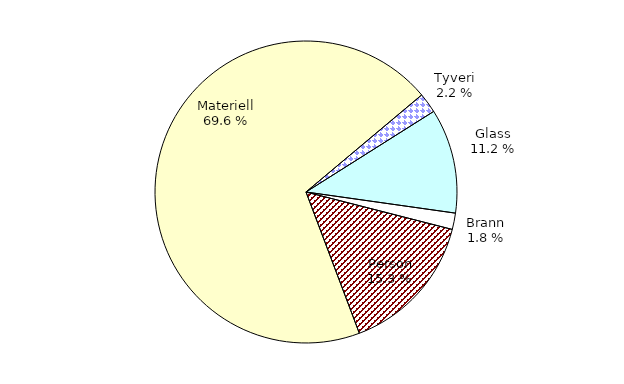
| Category | Series 0 |
|---|---|
| Tyveri | 271.504 |
| Glass | 1413.432 |
| Brann | 221.27 |
| Person | 1926.897 |
| Materiell | 8790.873 |